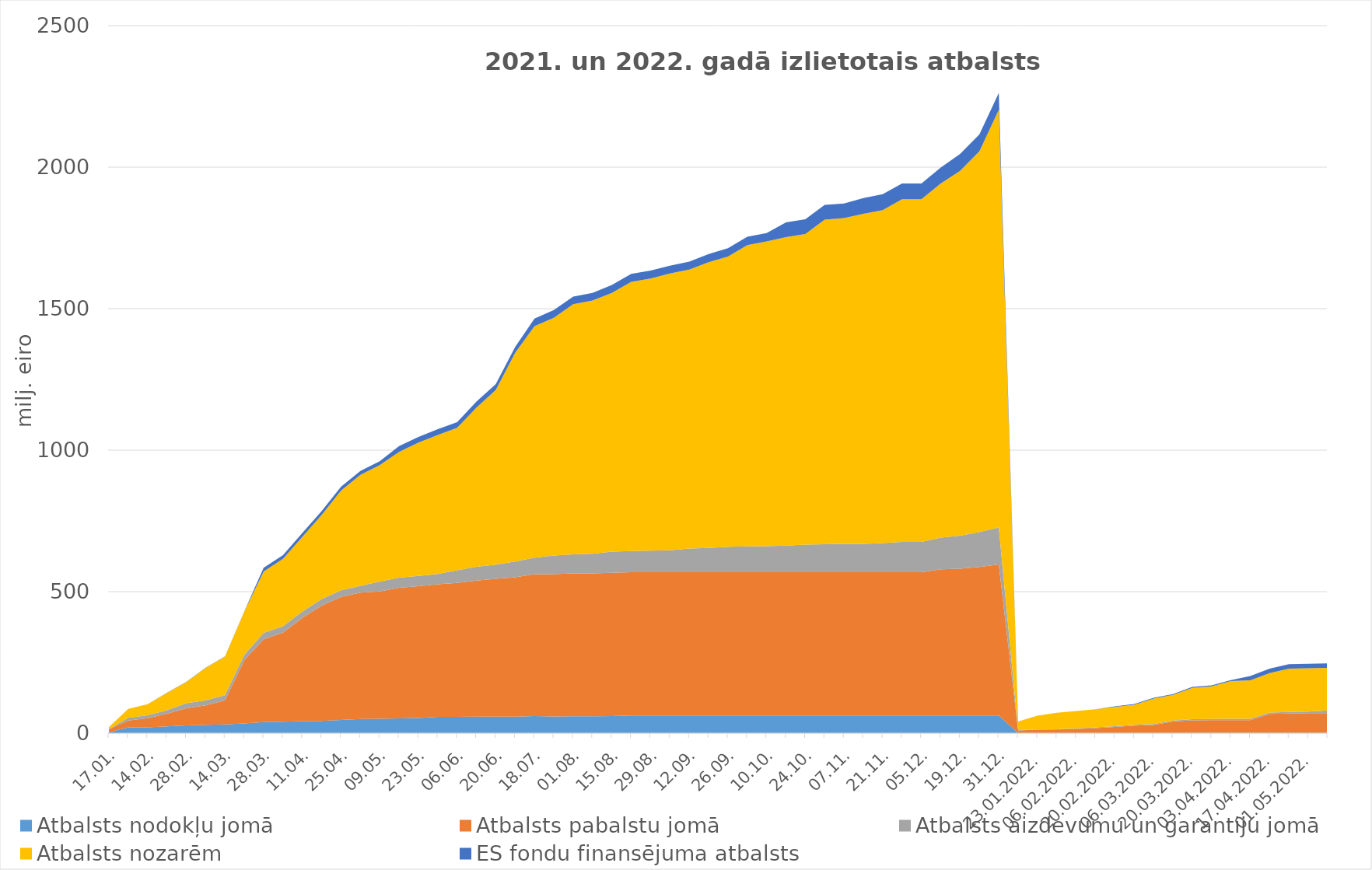
| Category | Atbalsts nodokļu jomā | Atbalsts pabalstu jomā | Atbalsts aizdevumu un garantiju jomā | Atbalsts nozarēm | ES fondu finansējuma atbalsts |
|---|---|---|---|---|---|
| 17.01. | 3.6 | 9.895 | 1 | 6.643 | 0 |
| 07.02. | 20.57 | 24.068 | 9.3 | 31.813 | 0 |
| 14.02. | 20.45 | 32.275 | 10.8 | 39.148 | 0 |
| 21.02. | 24.1 | 44.565 | 12.2 | 61.114 | 0.679 |
| 28.02. | 27.57 | 60.481 | 17.6 | 74.824 | 0.679 |
| 07.03. | 29.78 | 68.502 | 18.1 | 114.636 | 0.679 |
| 14.03. | 31 | 85.042 | 18.2 | 136.395 | 0.679 |
| 21.03. | 34.17 | 224.127 | 18.6 | 153.197 | 0.679 |
| 28.03. | 38.96 | 292.642 | 22.524 | 217.488 | 12.69 |
| 01.04. | 40.7 | 314.459 | 22.724 | 238.269 | 12.69 |
| 11.04. | 42.43 | 364.606 | 23.024 | 263.61 | 13.622 |
| 18.04. | 43.11 | 407.701 | 23.024 | 297.234 | 13.622 |
| 25.04. | 46.81 | 434.906 | 23.324 | 351.962 | 13.622 |
| 02.05. | 50.3 | 446.573 | 23.683 | 392.124 | 13.622 |
| 09.05. | 51 | 449.88 | 34.851 | 411.483 | 13.622 |
| 16.05. | 51.9 | 461.77 | 36.046 | 444.423 | 20.3 |
| 23.05. | 53.87 | 465.321 | 36.246 | 471.262 | 20.3 |
| 30.05. | 57.36 | 468.733 | 36.446 | 491.175 | 20.3 |
| 06.06. | 57.66 | 473.042 | 44.769 | 503.38 | 20.3 |
| 13.06. | 58.25 | 480.982 | 48.461 | 562.799 | 20.95 |
| 20.06. | 58.57 | 486.507 | 50.31 | 617.24 | 20.95 |
| 30.06. | 58.57 | 492 | 56 | 737.399 | 21 |
| 18.07. | 60.5 | 501 | 58.7 | 818.1 | 27 |
| 25.07. | 59 | 503 | 66 | 840 | 27 |
| 01.08. | 59.9 | 505 | 67 | 884 | 27 |
| 08.08. | 59.9 | 505 | 69 | 895 | 27 |
| 15.08. | 60.6 | 506 | 75 | 914 | 28 |
| 22.08. | 62.4 | 506.2 | 75.2 | 950.8 | 28 |
| 29.08. | 62.4 | 506.2 | 76.6 | 961.1 | 28 |
| 05.09. | 62.4 | 506.3 | 77.4 | 978 | 28 |
| 12.09. | 62.4 | 506.3 | 84.1 | 985.5 | 28 |
| 19.09. | 62.4 | 506.4 | 85.6 | 1009.6 | 29.3 |
| 26.09. | 62.4 | 506.4 | 89.9 | 1025.7 | 29.3 |
| 30.09. | 62.4 | 506.4 | 91 | 1065 | 29.3 |
| 10.10. | 62.4 | 506.4 | 92 | 1077 | 29.3 |
| 17.10. | 62.4 | 506.4 | 94 | 1090 | 52 |
| 24.10. | 62.4 | 506.5 | 97 | 1098 | 52 |
| 31.10. | 62.4 | 506.5 | 99 | 1147 | 52 |
| 07.11. | 62.4 | 506.5 | 100.187 | 1150.628 | 52 |
| 14.11. | 62.4 | 506.5 | 100.187 | 1166 | 56 |
| 21.11. | 62.4 | 506.5 | 103.04 | 1176.398 | 56 |
| 28.11. | 62.41 | 506.531 | 106.856 | 1210.709 | 56 |
| 05.12. | 62.41 | 506.531 | 106.856 | 1210.709 | 56 |
| 12.12. | 62.41 | 516.426 | 111.79 | 1251.623 | 56.399 |
| 19.12. | 62.43 | 518.474 | 116.668 | 1289.049 | 59.749 |
| 26.12. | 62.43 | 524.69 | 123.895 | 1345.409 | 59.749 |
| 31.12. | 62.55 | 533.456 | 130.716 | 1475.737 | 59.749 |
| 16.01.2022. | 0.4 | 9.3 | 1.441 | 29.8 | 0 |
| 23.01.2022. | 0.4 | 12.069 | 0.6 | 48.79 | 0 |
| 30.01.2022. | 0.63 | 12.651 | 0.704 | 58.272 | 0 |
| 06.02.2022. | 0.69 | 14.634 | 1.441 | 61.716 | 0 |
| 13.02.2022. | 0.75 | 17.103 | 2.672 | 64.123 | 0 |
| 20.02.2022. | 0.75 | 20.958 | 2.984 | 67.689 | 2.7 |
| 27.02.2022. | 0.75 | 25.776 | 2.984 | 70.55 | 2.7 |
| 06.03.2022. | 0.75 | 28.428 | 3.131 | 89.881 | 2.7 |
| 13.03.2022. | 0.75 | 40.118 | 3.73 | 91.024 | 2.7 |
| 20.03.2022. | 1.06 | 44.474 | 3.944 | 110.343 | 3.809 |
| 27.03.2022. | 1.06 | 44.664 | 4.494 | 114.973 | 3.809 |
| 03.04.2022. | 1.06 | 44.727 | 4.719 | 133.526 | 3.809 |
| 10.04.2022. | 1.26 | 44.77 | 4.833 | 135.627 | 15.7 |
| 17.04.2022. | 1.26 | 66.882 | 4.961 | 139.245 | 15.7 |
| 24.04.2022. | 1.26 | 68.175 | 5.151 | 153.276 | 15.7 |
| 01.05.2022. | 1.26 | 69.558 | 5.428 | 153.276 | 15.7 |
| 08.05.2022. | 1.26 | 69.559 | 9.71 | 150.404 | 15.7 |